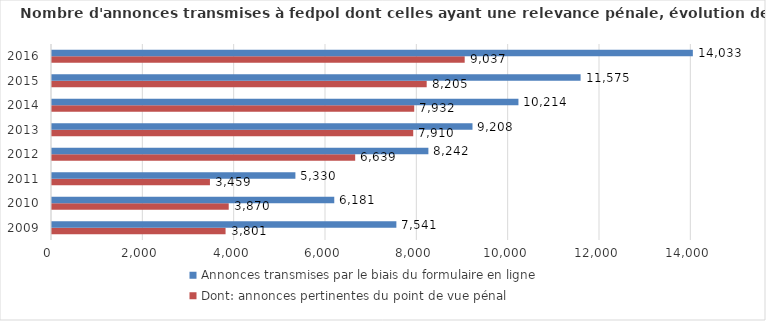
| Category | Dont: annonces pertinentes du point de vue pénal | Annonces transmises par le biais du formulaire en ligne |
|---|---|---|
| 2009.0 | 3800.664 | 7541 |
| 2010.0 | 3869.924 | 6181 |
| 2011.0 | 3458.637 | 5330 |
| 2012.0 | 6639 | 8242 |
| 2013.0 | 7910 | 9208 |
| 2014.0 | 7932 | 10214 |
| 2015.0 | 8205 | 11575 |
| 2016.0 | 9037 | 14033 |